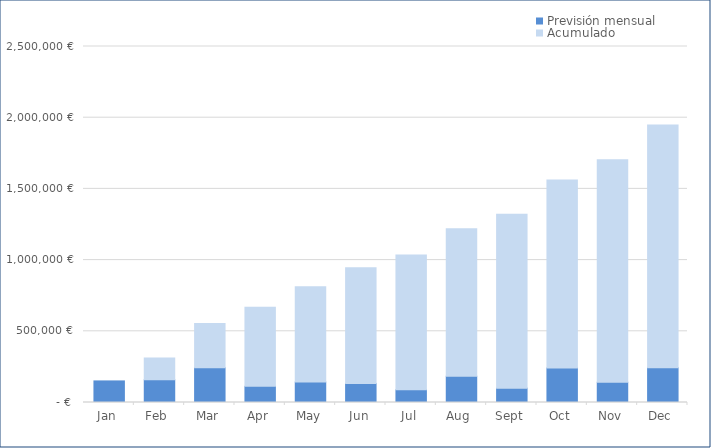
| Category | Previsión mensual | Acumulado |
|---|---|---|
| 2020-01-01 | 151600 | 0 |
| 2020-02-01 | 160320 | 151600 |
| 2020-03-01 | 243500 | 311920 |
| 2020-04-01 | 113450 | 555420 |
| 2020-05-01 | 143200 | 668870 |
| 2020-06-01 | 134000 | 812070 |
| 2020-07-01 | 89400 | 946070 |
| 2020-08-01 | 184900 | 1035470 |
| 2020-09-01 | 100800 | 1220370 |
| 2020-10-01 | 241850 | 1321170 |
| 2020-11-01 | 142425 | 1563020 |
| 2020-12-01 | 243400 | 1705445 |